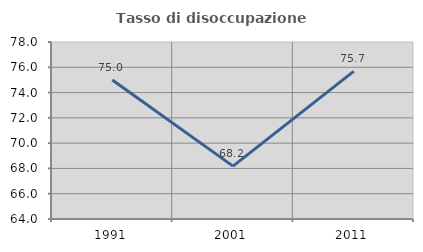
| Category | Tasso di disoccupazione giovanile  |
|---|---|
| 1991.0 | 75 |
| 2001.0 | 68.182 |
| 2011.0 | 75.676 |